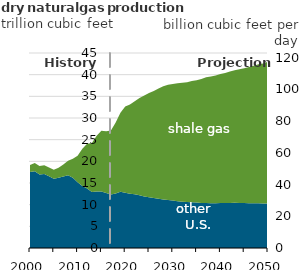
| Category | Series 0 |
|---|---|
| 0 | 52.553 |
| 1 | 53.743 |
| 2 | 51.857 |
| 3 | 52.325 |
| 4 | 50.934 |
| 5 | 49.454 |
| 6 | 50.695 |
| 7 | 52.784 |
| 8 | 55.229 |
| 9 | 56.504 |
| 10 | 58.399 |
| 11 | 62.745 |
| 12 | 65.845 |
| 13 | 66.317 |
| 14 | 71.029 |
| 15 | 74.136 |
| 16 | 73.807 |
| 17 | 74.243 |
| 18 | 79.337 |
| 19 | 85.453 |
| 20 | 89.484 |
| 21 | 90.657 |
| 22 | 92.724 |
| 23 | 94.813 |
| 24 | 96.38 |
| 25 | 98.041 |
| 26 | 99.275 |
| 27 | 100.871 |
| 28 | 102.327 |
| 29 | 103.186 |
| 30 | 103.642 |
| 31 | 104.122 |
| 32 | 104.43 |
| 33 | 104.793 |
| 34 | 105.607 |
| 35 | 106.084 |
| 36 | 106.897 |
| 37 | 107.879 |
| 38 | 108.412 |
| 39 | 109.098 |
| 40 | 110.013 |
| 41 | 110.696 |
| 42 | 111.557 |
| 43 | 112.306 |
| 44 | 113.029 |
| 45 | 113.597 |
| 46 | 114.411 |
| 47 | 115.275 |
| 48 | 116.163 |
| 49 | 116.712 |
| 50 | 117.751 |